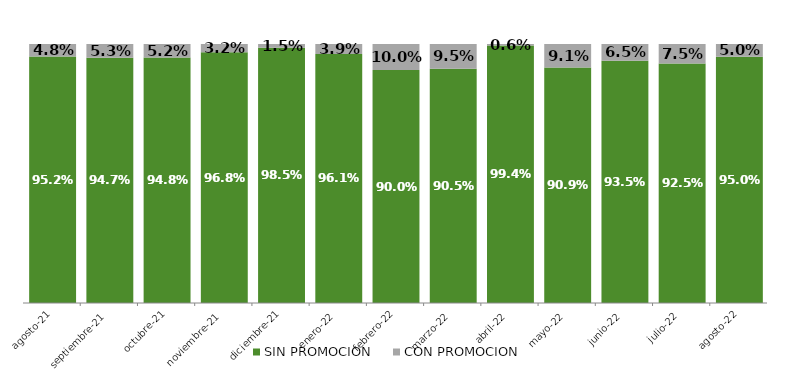
| Category | SIN PROMOCION   | CON PROMOCION   |
|---|---|---|
| 2021-08-01 | 0.952 | 0.048 |
| 2021-09-01 | 0.947 | 0.053 |
| 2021-10-01 | 0.948 | 0.052 |
| 2021-11-01 | 0.968 | 0.032 |
| 2021-12-01 | 0.985 | 0.015 |
| 2022-01-01 | 0.961 | 0.039 |
| 2022-02-01 | 0.9 | 0.1 |
| 2022-03-01 | 0.905 | 0.095 |
| 2022-04-01 | 0.994 | 0.006 |
| 2022-05-01 | 0.909 | 0.091 |
| 2022-06-01 | 0.935 | 0.065 |
| 2022-07-01 | 0.925 | 0.075 |
| 2022-08-01 | 0.95 | 0.05 |